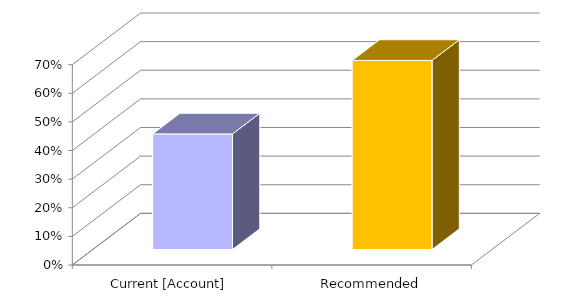
| Category | Series 0 |
|---|---|
| Current [Account] | 0.404 |
| Recommended | 0.661 |